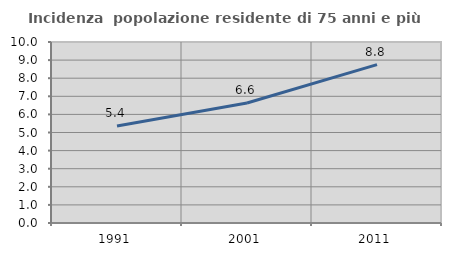
| Category | Incidenza  popolazione residente di 75 anni e più |
|---|---|
| 1991.0 | 5.362 |
| 2001.0 | 6.63 |
| 2011.0 | 8.751 |